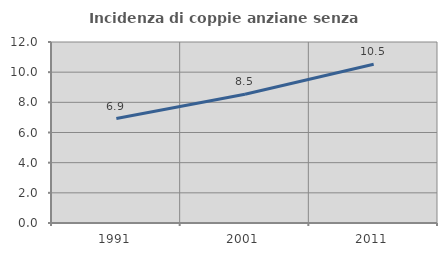
| Category | Incidenza di coppie anziane senza figli  |
|---|---|
| 1991.0 | 6.924 |
| 2001.0 | 8.54 |
| 2011.0 | 10.524 |